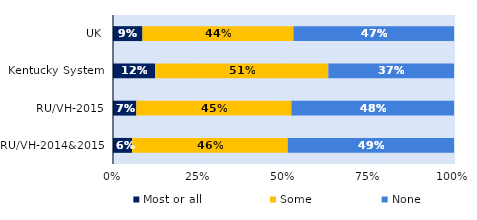
| Category | Most or all | Some | None |
|---|---|---|---|
| UK | 0.086 | 0.443 | 0.471 |
| Kentucky System | 0.123 | 0.508 | 0.368 |
| RU/VH-2015 | 0.068 | 0.455 | 0.477 |
| RU/VH-2014&2015 | 0.056 | 0.456 | 0.488 |